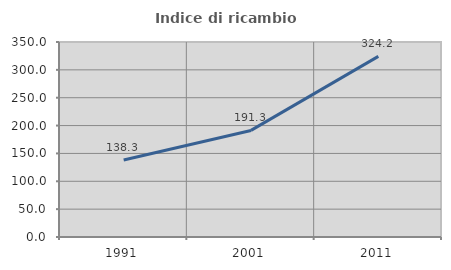
| Category | Indice di ricambio occupazionale  |
|---|---|
| 1991.0 | 138.312 |
| 2001.0 | 191.304 |
| 2011.0 | 324.194 |